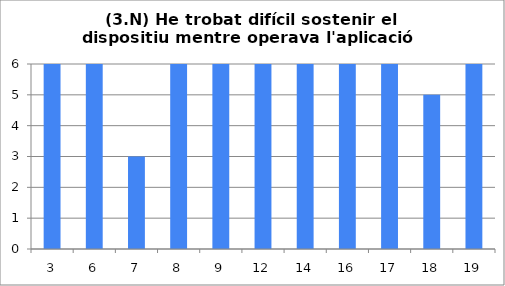
| Category | 3 |
|---|---|
| 3.0 | 6 |
| 6.0 | 6 |
| 7.0 | 3 |
| 8.0 | 6 |
| 9.0 | 6 |
| 12.0 | 6 |
| 14.0 | 6 |
| 16.0 | 6 |
| 17.0 | 6 |
| 18.0 | 5 |
| 19.0 | 6 |